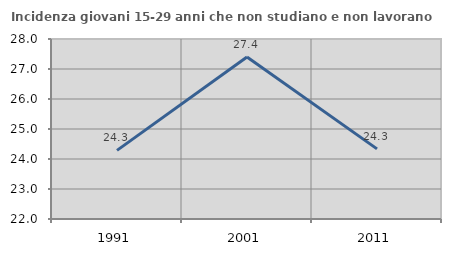
| Category | Incidenza giovani 15-29 anni che non studiano e non lavorano  |
|---|---|
| 1991.0 | 24.287 |
| 2001.0 | 27.397 |
| 2011.0 | 24.337 |